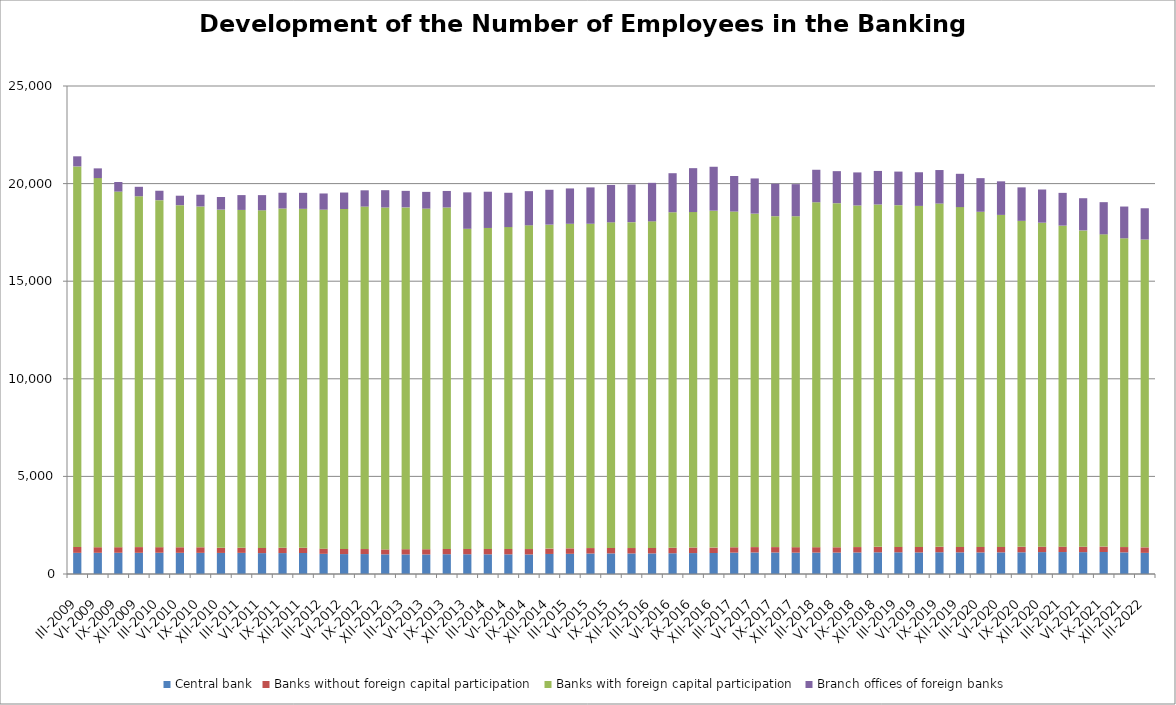
| Category | Central bank | Banks without foreign capital participation | Banks with foreign capital participation | Branch offices of foreign banks |
|---|---|---|---|---|
| III-2009 | 1084 | 301 | 19495 | 518 |
| VI-2009 | 1086 | 286 | 18910 | 498 |
| IX-2009 | 1088 | 285 | 18218 | 490 |
| XII-2009 | 1086 | 291 | 17975 | 484 |
| III-2010 | 1089 | 286 | 17776 | 483 |
| VI-2010 | 1085 | 284 | 17526 | 485 |
| IX-2010 | 1083 | 285 | 17461 | 600 |
| XII-2010 | 1079 | 264 | 17323 | 647 |
| III-2011 | 1082 | 261 | 17308 | 760 |
| VI-2011 | 1070 | 267 | 17294 | 779 |
| IX-2011 | 1072 | 270 | 17382 | 807 |
| XII-2011 | 1075 | 267 | 17366 | 819 |
| III-2012 | 1033 | 265 | 17369 | 827 |
| VI-2012 | 1020 | 263 | 17416 | 843 |
| IX-2012 | 1021 | 257 | 17545 | 833 |
| XII-2012 | 1007 | 253 | 17516 | 886 |
| III-2013 | 1003 | 268 | 17511 | 846 |
| VI-2013 | 1001 | 268 | 17451 | 856 |
| IX-2013 | 1013 | 271 | 17492 | 847 |
| XII-2013 | 1011 | 275 | 16399 | 1866 |
| III-2014 | 1008 | 277 | 16442 | 1857 |
| VI-2014 | 1007 | 273 | 16492 | 1758 |
| IX-2014 | 1001 | 277 | 16584 | 1751 |
| XII-2014 | 1027 | 274 | 16596 | 1786 |
| III-2015 | 1034 | 280 | 16627 | 1811 |
| VI-2015 | 1049 | 279 | 16615 | 1862 |
| IX-2015 | 1056 | 280 | 16680 | 1915 |
| XII-2015 | 1053 | 277 | 16696 | 1927 |
| III-2016 | 1055 | 277 | 16734 | 1973 |
| VI-2016 | 1063 | 279 | 17191 | 1999 |
| IX-2016 | 1072 | 284 | 17186 | 2249 |
| XII-2016 | 1075 | 277 | 17261 | 2250 |
| III-2017 | 1094 | 275 | 17199 | 1821 |
| VI-2017 | 1102 | 275 | 17084 | 1803 |
| IX-2017 | 1101 | 276 | 16954 | 1662 |
| XII-2017 | 1093 | 282 | 16953 | 1644 |
| III-2018 | 1097 | 277 | 17670 | 1665 |
| VI-2018 | 1097 | 272 | 17628 | 1641 |
| IX-2018 | 1102 | 277 | 17500 | 1694 |
| XII-2018 | 1110 | 281 | 17539 | 1719 |
| III-2019 | 1111 | 276 | 17509 | 1719 |
| VI-2019 | 1105 | 280 | 17472 | 1724 |
| IX-2019 | 1114 | 279 | 17585 | 1717 |
| XII-2019 | 1109 | 280 | 17407 | 1706 |
| III-2020 | 1105 | 278 | 17174 | 1722 |
| VI-2020 | 1109 | 279 | 17008 | 1720 |
| IX-2020 | 1112 | 279 | 16701 | 1715 |
| XII-2020 | 1122 | 277 | 16599 | 1700 |
| III-2021 | 1125 | 277 | 16444 | 1679 |
| VI-2021 | 1120 | 276 | 16206 | 1649 |
| IX-2021 | 1128 | 277 | 15995 | 1649 |
| XII-2021 | 1108 | 272 | 15818 | 1627 |
| III-2022 | 1083 | 281 | 15772 | 1600 |